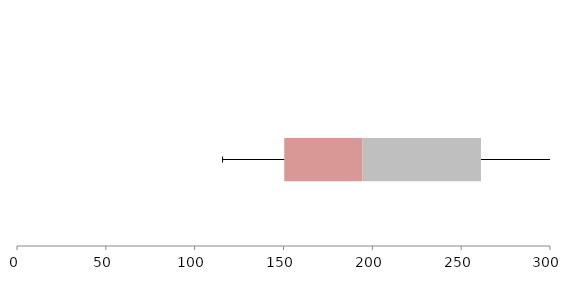
| Category | Series 1 | Series 2 | Series 3 |
|---|---|---|---|
| 0 | 150.419 | 44.103 | 66.622 |